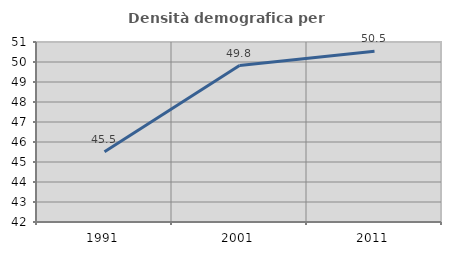
| Category | Densità demografica |
|---|---|
| 1991.0 | 45.51 |
| 2001.0 | 49.824 |
| 2011.0 | 50.535 |